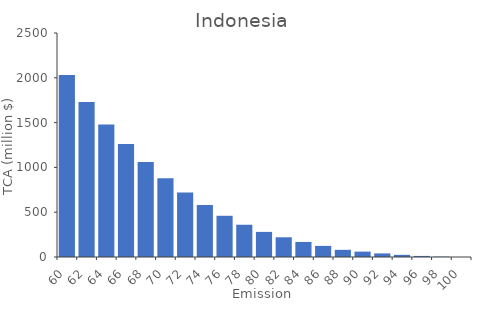
| Category | TCA (million $) |
|---|---|
| 60.0 | 2030 |
| 62.0 | 1730 |
| 64.0 | 1480 |
| 66.0 | 1260 |
| 68.0 | 1060 |
| 70.0 | 880 |
| 72.0 | 720 |
| 74.0 | 580 |
| 76.0 | 460 |
| 78.0 | 360 |
| 80.0 | 280 |
| 82.0 | 220 |
| 84.0 | 168 |
| 86.0 | 124 |
| 88.0 | 80 |
| 90.0 | 60 |
| 92.0 | 40 |
| 94.0 | 24 |
| 96.0 | 12 |
| 98.0 | 4 |
| 100.0 | 0 |